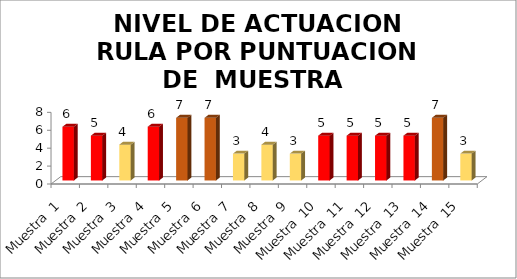
| Category | NIVEL DE ACTUACION   RULA |
|---|---|
| Muestra  1 | 6 |
| Muestra  2 | 5 |
| Muestra  3 | 4 |
| Muestra  4 | 6 |
| Muestra  5 | 7 |
| Muestra  6 | 7 |
| Muestra  7 | 3 |
| Muestra  8 | 4 |
| Muestra  9 | 3 |
| Muestra  10 | 5 |
| Muestra  11 | 5 |
| Muestra  12 | 5 |
| Muestra  13 | 5 |
| Muestra  14 | 7 |
| Muestra  15 | 3 |